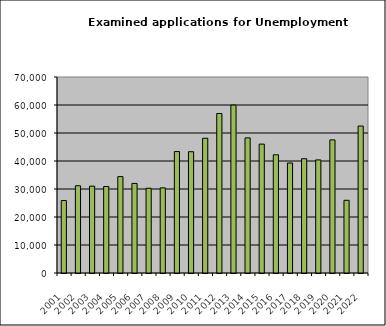
| Category | Series 0 |
|---|---|
| 2001.0 | 25875 |
| 2002.0 | 31162 |
| 2003.0 | 31015 |
| 2004.0 | 30893 |
| 2005.0 | 34415 |
| 2006.0 | 31999 |
| 2007.0 | 30257 |
| 2008.0 | 30398 |
| 2009.0 | 43374 |
| 2010.0 | 43317 |
| 2011.0 | 48127 |
| 2012.0 | 56963 |
| 2013.0 | 59967 |
| 2014.0 | 48255 |
| 2015.0 | 46030 |
| 2016.0 | 42213 |
| 2017.0 | 39296 |
| 2018.0 | 40805 |
| 2019.0 | 40387 |
| 2020.0 | 47543 |
| 2021.0 | 25962 |
| 2022.0 | 52486 |